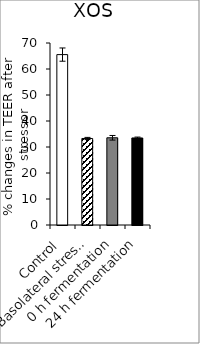
| Category | average |
|---|---|
| Control | 65.541 |
| Basolateral stressor | 33.276 |
| 0 h fermentation | 33.545 |
| 24 h fermentation | 33.478 |